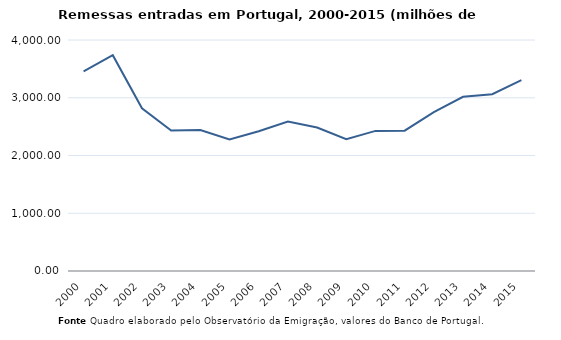
| Category | Entradas |
|---|---|
| 2000.0 | 3458.12 |
| 2001.0 | 3736.82 |
| 2002.0 | 2817.88 |
| 2003.0 | 2433.78 |
| 2004.0 | 2442.16 |
| 2005.0 | 2277.25 |
| 2006.0 | 2420.27 |
| 2007.0 | 2588.42 |
| 2008.0 | 2484.68 |
| 2009.0 | 2281.87 |
| 2010.0 | 2425.9 |
| 2011.0 | 2430.49 |
| 2012.0 | 2749.46 |
| 2013.0 | 3015.78 |
| 2014.0 | 3060.71 |
| 2015.0 | 3303.65 |